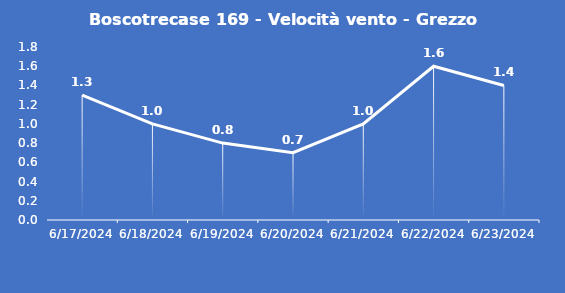
| Category | Boscotrecase 169 - Velocità vento - Grezzo (m/s) |
|---|---|
| 6/17/24 | 1.3 |
| 6/18/24 | 1 |
| 6/19/24 | 0.8 |
| 6/20/24 | 0.7 |
| 6/21/24 | 1 |
| 6/22/24 | 1.6 |
| 6/23/24 | 1.4 |